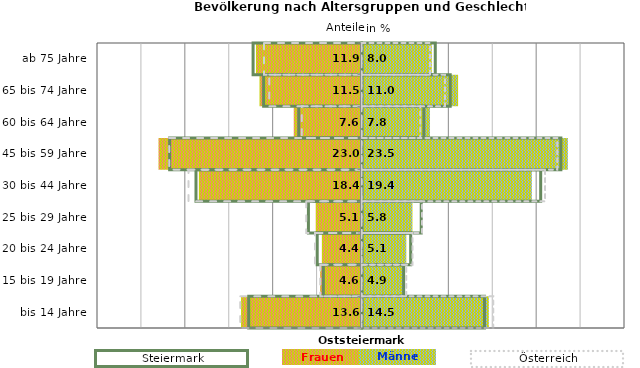
| Category | Frauen | Männer | Frauen Spalte2 | Männer Spalte2 | Frauen Spalte3 | Männer Spalte3 |
|---|---|---|---|---|---|---|
| bis 14 Jahre | -13.6 | 14.5 | 14 | -12.9 | -13.8 | 15 |
| 15 bis 19 Jahre | -4.6 | 4.9 | 4.8 | -4.4 | -4.7 | 5.1 |
| 20 bis 24 Jahre | -4.4 | 5.1 | 5.6 | -5.1 | -5.3 | 5.8 |
| 25 bis 29 Jahre | -5.1 | 5.8 | 6.8 | -6.1 | -6.3 | 6.9 |
| 30 bis 44 Jahre | -18.4 | 19.4 | 20.4 | -18.9 | -19.7 | 20.9 |
| 45 bis 59 Jahre | -23 | 23.5 | 22.7 | -21.9 | -21.9 | 22.3 |
| 60 bis 64 Jahre | -7.6 | 7.8 | 7.1 | -7.2 | -6.8 | 6.7 |
| 65 bis 74 Jahre | -11.5 | 11 | 10.1 | -11.2 | -10.5 | 9.5 |
| ab 75 Jahre | -11.9 | 8 | 8.4 | -12.4 | -11.1 | 7.8 |